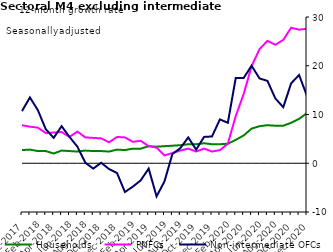
| Category | zero | Households | PNFCs | Non-intermediate OFCs |
|---|---|---|---|---|
| Dec-2017 | 0 | 2.7 | 7.8 | 10.7 |
| Jan-2018 | 0 | 2.8 | 7.5 | 13.5 |
| Feb-2018 | 0 | 2.5 | 7.3 | 10.9 |
| Mar-2018 | 0 | 2.5 | 6.2 | 7 |
| Apr-2018 | 0 | 2 | 6.3 | 5.2 |
| May-2018 | 0 | 2.6 | 6.4 | 7.6 |
| Jun-2018 | 0 | 2.5 | 5.4 | 5.4 |
| Jul-2018 | 0 | 2.4 | 6.5 | 3.4 |
| Aug-2018 | 0 | 2.6 | 5.3 | 0.1 |
| Sep-2018 | 0 | 2.5 | 5.2 | -1.1 |
| Oct-2018 | 0 | 2.5 | 5.1 | 0.1 |
| Nov-2018 | 0 | 2.4 | 4.3 | -1.2 |
| Dec-2018 | 0 | 2.8 | 5.4 | -2 |
| Jan-2019 | 0 | 2.7 | 5.3 | -5.9 |
| Feb-2019 | 0 | 3 | 4.4 | -4.8 |
| Mar-2019 | 0 | 3 | 4.6 | -3.5 |
| Apr-2019 | 0 | 3.5 | 3.5 | -1.1 |
| May-2019 | 0 | 3.4 | 3.2 | -6.8 |
| Jun-2019 | 0 | 3.5 | 1.6 | -3.7 |
| Jul-2019 | 0 | 3.6 | 2.1 | 1.9 |
| Aug-2019 | 0 | 3.7 | 2.6 | 3.1 |
| Sep-2019 | 0 | 3.9 | 3 | 5.3 |
| Oct-2019 | 0 | 3.9 | 2.4 | 2.8 |
| Nov-2019 | 0 | 4.1 | 3 | 5.4 |
| Dec-2019 | 0 | 3.9 | 2.4 | 5.5 |
| Jan-2020 | 0 | 3.9 | 2.7 | 9 |
| Feb-2020 | 0 | 4 | 4 | 8.3 |
| Mar-2020 | 0 | 4.8 | 9.7 | 17.5 |
| Apr-2020 | 0 | 5.7 | 14.2 | 17.5 |
| May-2020 | 0 | 7.1 | 19.9 | 20 |
| Jun-2020 | 0 | 7.6 | 23.4 | 17.4 |
| Jul-2020 | 0 | 7.8 | 25.1 | 16.9 |
| Aug-2020 | 0 | 7.7 | 24.3 | 13.3 |
| Sep-2020 | 0 | 7.7 | 25.3 | 11.5 |
| Oct-2020 | 0 | 8.3 | 27.8 | 16.4 |
| Nov-2020 | 0 | 9.1 | 27.4 | 18.1 |
| Dec-2020 | 0 | 10.3 | 27.6 | 13.8 |